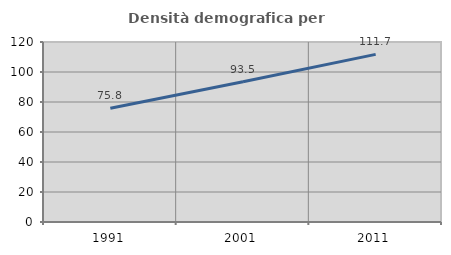
| Category | Densità demografica |
|---|---|
| 1991.0 | 75.808 |
| 2001.0 | 93.5 |
| 2011.0 | 111.73 |